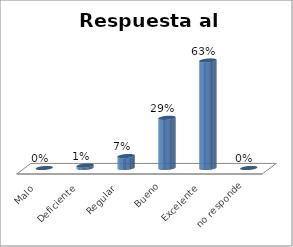
| Category | Series 0 |
|---|---|
| Malo | 0 |
| Deficiente | 0.014 |
| Regular  | 0.069 |
| Bueno | 0.292 |
| Excelente | 0.625 |
| no responde | 0 |